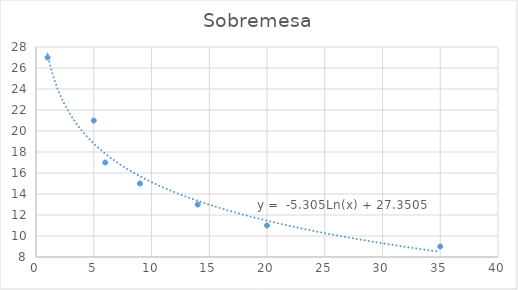
| Category | Sobremesa |
|---|---|
| 35.0 | 9 |
| 20.0 | 11 |
| 14.0 | 13 |
| 9.0 | 15 |
| 6.0 | 17 |
| 5.0 | 21 |
| 1.0 | 27 |